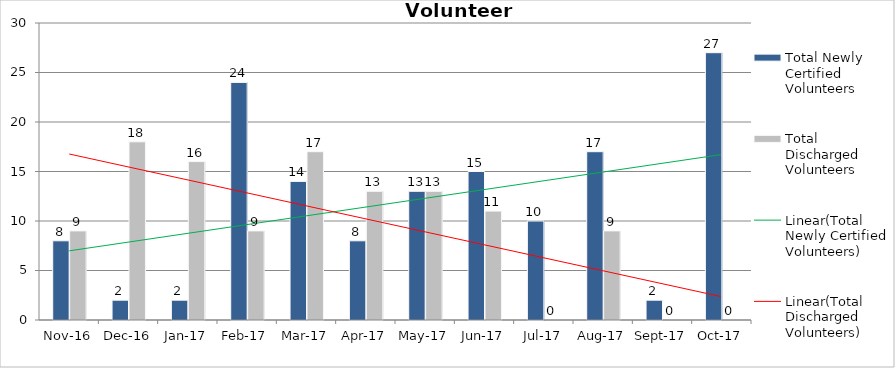
| Category | Total Newly Certified Volunteers | Total Discharged Volunteers |
|---|---|---|
| 2016-11-01 | 8 | 9 |
| 2016-12-01 | 2 | 18 |
| 2017-01-01 | 2 | 16 |
| 2017-02-01 | 24 | 9 |
| 2017-03-01 | 14 | 17 |
| 2017-04-01 | 8 | 13 |
| 2017-05-01 | 13 | 13 |
| 2017-06-01 | 15 | 11 |
| 2017-07-01 | 10 | 0 |
| 2017-08-01 | 17 | 9 |
| 2017-09-01 | 2 | 0 |
| 2017-10-01 | 27 | 0 |